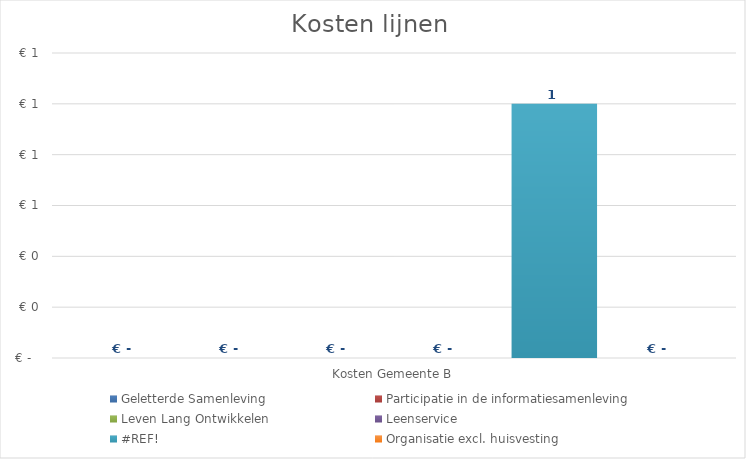
| Category | Geletterde Samenleving | Participatie in de informatiesamenleving | Leven Lang Ontwikkelen | Leenservice | #REF! | Organisatie excl. huisvesting |
|---|---|---|---|---|---|---|
| Kosten Gemeente B | 0 | 0 | 0 | 0 | 1 | 0 |